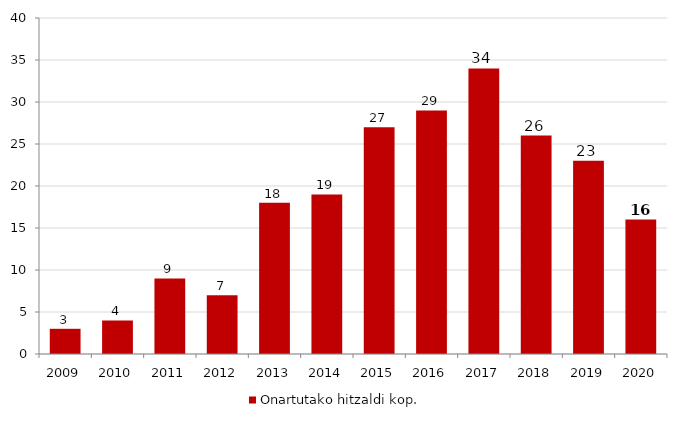
| Category | Onartutako hitzaldi kop. |
|---|---|
| 2009.0 | 3 |
| 2010.0 | 4 |
| 2011.0 | 9 |
| 2012.0 | 7 |
| 2013.0 | 18 |
| 2014.0 | 19 |
| 2015.0 | 27 |
| 2016.0 | 29 |
| 2017.0 | 34 |
| 2018.0 | 26 |
| 2019.0 | 23 |
| 2020.0 | 16 |